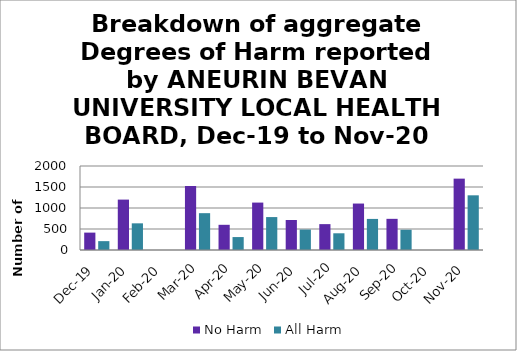
| Category | No Harm | All Harm |
|---|---|---|
| Dec-19 | 414 | 211 |
| Jan-20 | 1200 | 635 |
| Feb-20 | 0 | 0 |
| Mar-20 | 1525 | 877 |
| Apr-20 | 600 | 308 |
| May-20 | 1129 | 784 |
| Jun-20 | 715 | 487 |
| Jul-20 | 616 | 398 |
| Aug-20 | 1106 | 740 |
| Sep-20 | 742 | 482 |
| Oct-20 | 0 | 0 |
| Nov-20 | 1699 | 1302 |